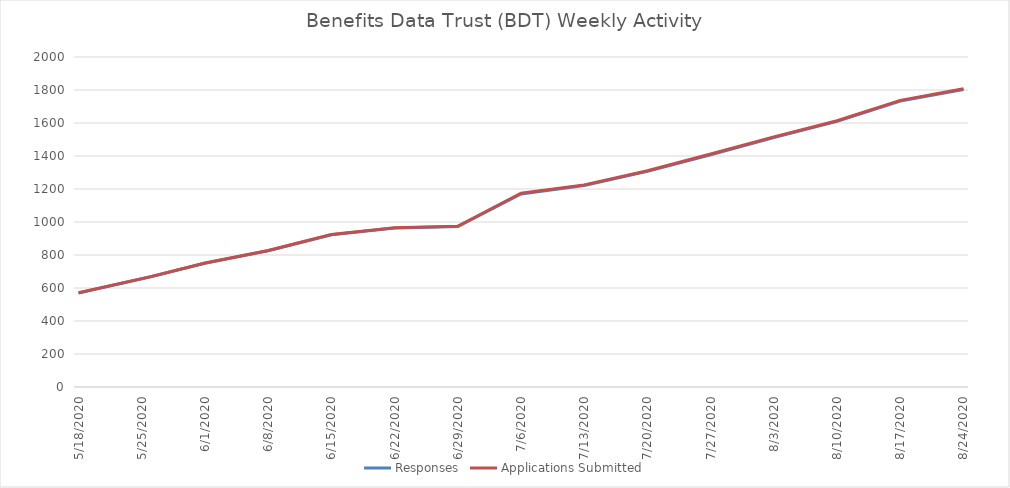
| Category | Responses | Applications Submitted |
|---|---|---|
| 5/18/20 | 570 | 571 |
| 5/26/20 | 668 | 669 |
| 6/1/20 | 750 | 751 |
| 6/8/20 | 826 | 827 |
| 6/15/20 | 923 | 924 |
| 6/22/20 | 964 | 965 |
| 6/29/20 | 973 | 974 |
| 7/6/20 | 1170 | 1174 |
| 7/13/20 | 1221 | 1225 |
| 7/20/20 | 1307 | 1311 |
| 7/27/20 | 1408 | 1412 |
| 8/3/20 | 1512 | 1516 |
| 8/10/20 | 1610 | 1614 |
| 8/17/20 | 1733 | 1737 |
| 8/24/20 | 1803 | 1807 |